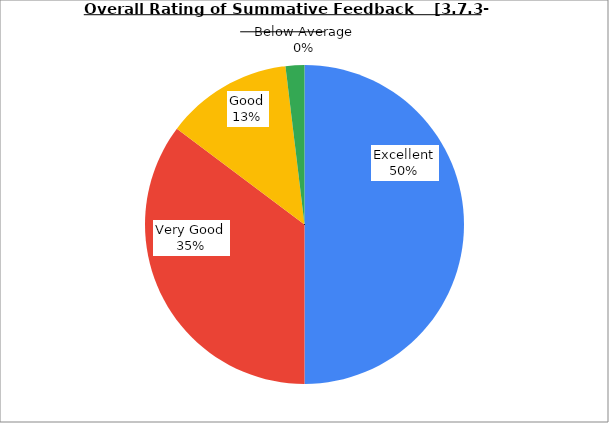
| Category | Series 0 |
|---|---|
| Excellent | 50 |
| Very Good | 35.238 |
| Good | 12.857 |
| Average | 1.905 |
| Below Average | 0 |